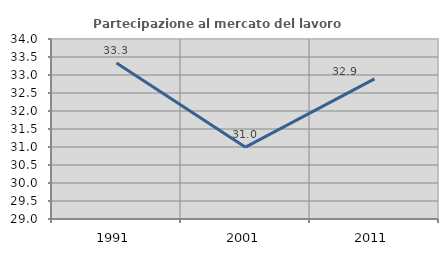
| Category | Partecipazione al mercato del lavoro  femminile |
|---|---|
| 1991.0 | 33.333 |
| 2001.0 | 30.996 |
| 2011.0 | 32.891 |